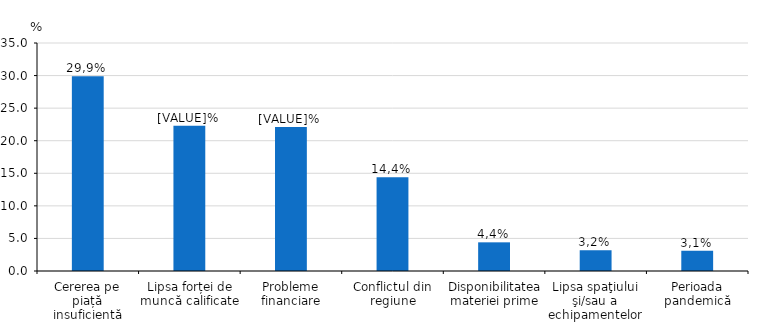
| Category | Series 0 |
|---|---|
| Cererea pe piață insuficientă | 29.9 |
| Lipsa forței de muncă calificate | 22.3 |
| Probleme financiare | 22.1 |
| Conflictul din regiune | 14.4 |
| Disponibilitatea materiei prime | 4.4 |
| Lipsa spaţiului şi/sau a echipamentelor | 3.2 |
| Perioada pandemică | 3.1 |